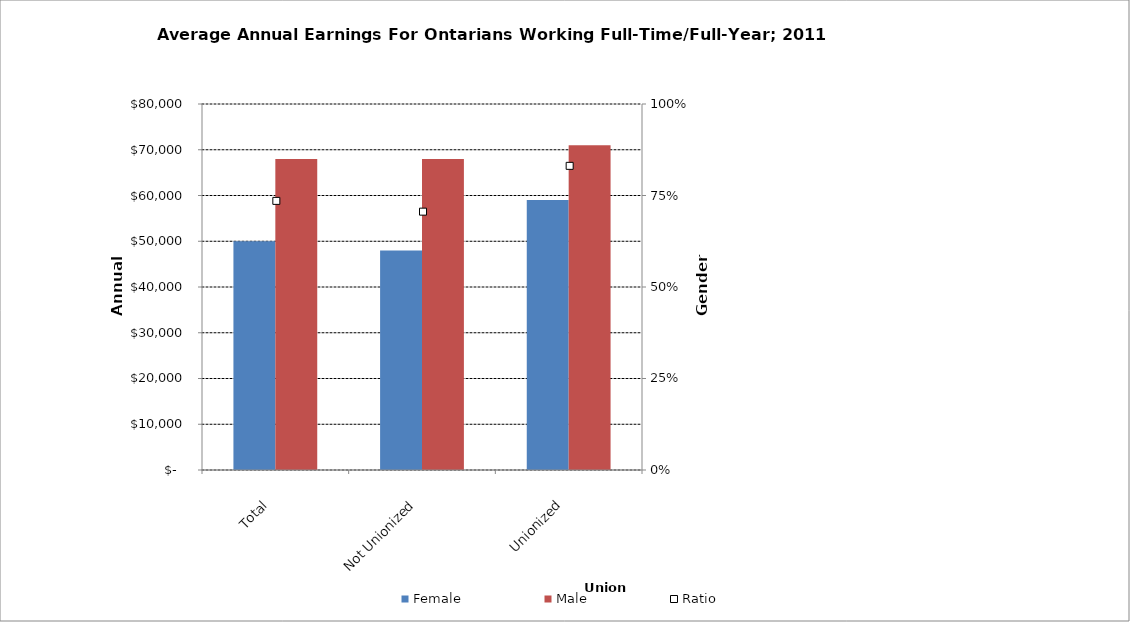
| Category | Female | Male |
|---|---|---|
| Total | 50000 | 68000 |
|  Not Unionized  | 48000 | 68000 |
|  Unionized  | 59000 | 71000 |